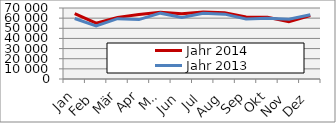
| Category | Jahr 2014 | Jahr 2013 |
|---|---|---|
| 0 | 64556.884 | 59683.364 |
| 1 | 55004.687 | 52374.689 |
| 2 | 60770.277 | 59497.517 |
| 3 | 63565.178 | 58562.417 |
| 4 | 65729.813 | 64908.724 |
| 5 | 64266.71 | 60638.725 |
| 6 | 65932.95 | 64868.483 |
| 7 | 65213.505 | 63934.829 |
| 8 | 61072.078 | 59177.253 |
| 9 | 60775.235 | 59824.023 |
| 10 | 56367.413 | 59008.523 |
| 11 | 62641.039 | 63307.121 |